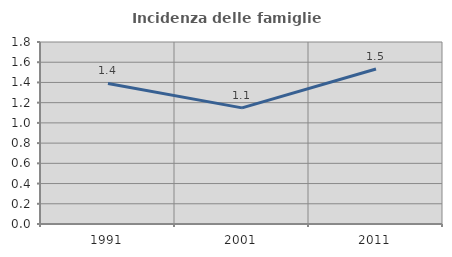
| Category | Incidenza delle famiglie numerose |
|---|---|
| 1991.0 | 1.39 |
| 2001.0 | 1.149 |
| 2011.0 | 1.533 |